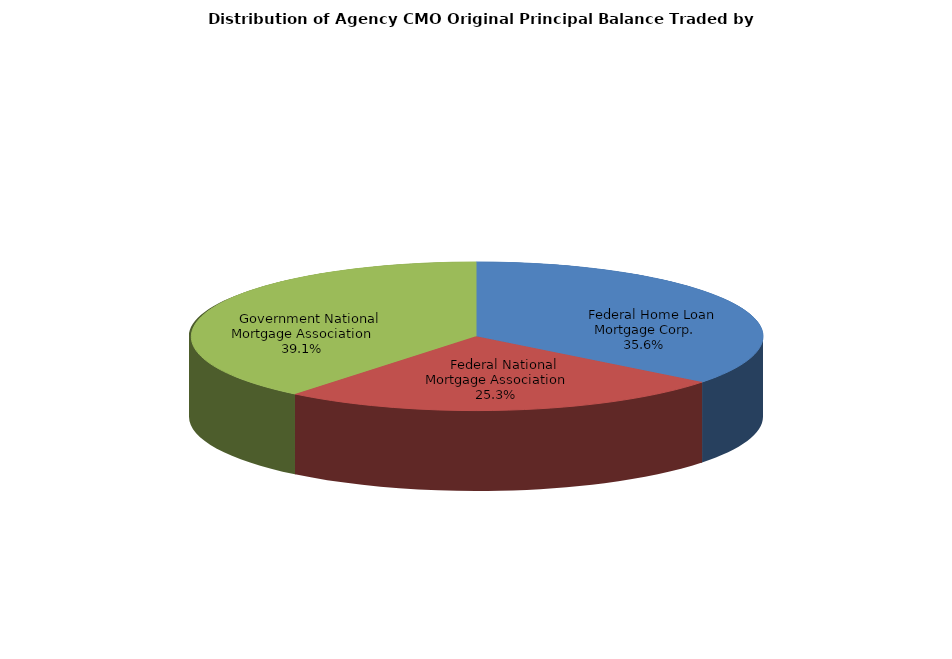
| Category | Series 0 |
|---|---|
|     Federal Home Loan Mortgage Corp. | 2062627894.2 |
|     Federal National Mortgage Association | 1466996409.548 |
|     Government National Mortgage Association | 2269842880.357 |